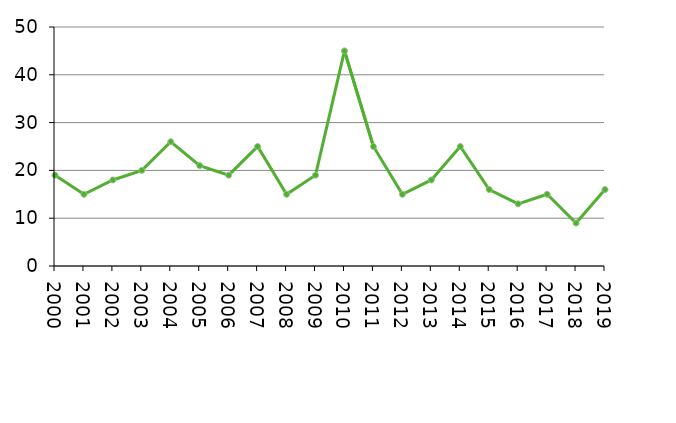
| Category | Avlidna |
|---|---|
| 2000 | 19 |
| 2001 | 15 |
| 2002 | 18 |
| 2003 | 20 |
| 2004 | 26 |
| 2005 | 21 |
| 2006 | 19 |
| 2007 | 25 |
| 2008 | 15 |
| 2009 | 19 |
| 2010 | 45 |
| 2011 | 25 |
| 2012 | 15 |
| 2013 | 18 |
| 2014 | 25 |
| 2015 | 16 |
| 2016 | 13 |
| 2017 | 15 |
| 2018 | 9 |
| 2019 | 16 |